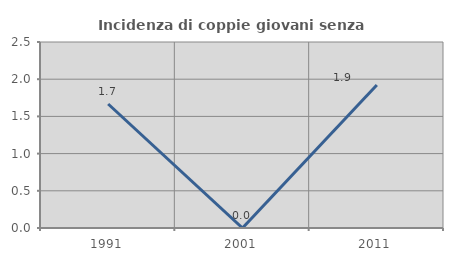
| Category | Incidenza di coppie giovani senza figli |
|---|---|
| 1991.0 | 1.667 |
| 2001.0 | 0 |
| 2011.0 | 1.923 |